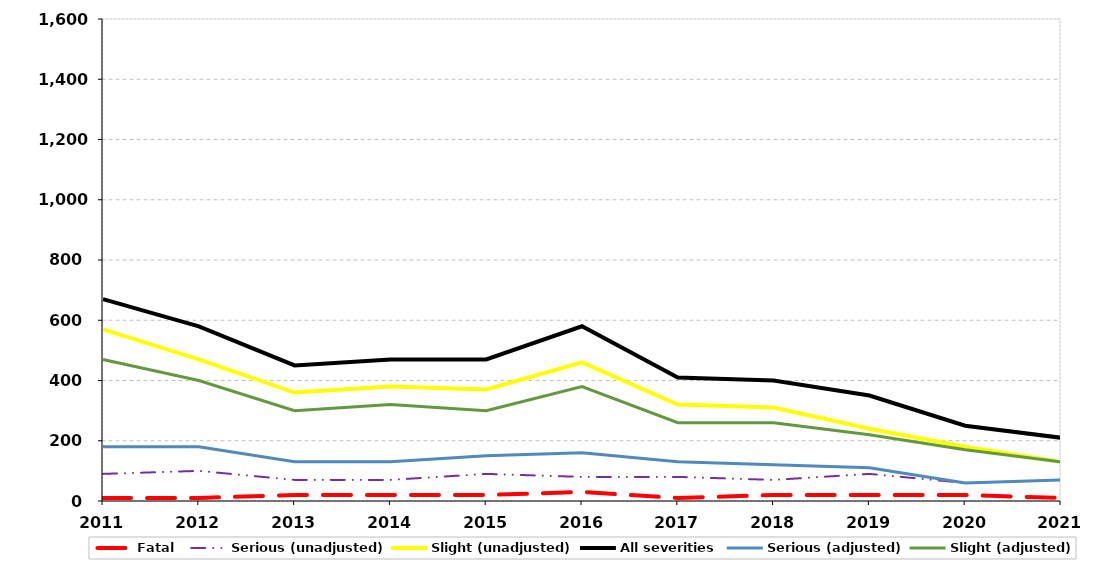
| Category | Fatal | Serious (unadjusted) | Slight (unadjusted) | All severities | Serious (adjusted) | Slight (adjusted) |
|---|---|---|---|---|---|---|
| 2011.0 | 10 | 90 | 570 | 670 | 180 | 470 |
| 2012.0 | 10 | 100 | 470 | 580 | 180 | 400 |
| 2013.0 | 20 | 70 | 360 | 450 | 130 | 300 |
| 2014.0 | 20 | 70 | 380 | 470 | 130 | 320 |
| 2015.0 | 20 | 90 | 370 | 470 | 150 | 300 |
| 2016.0 | 30 | 80 | 460 | 580 | 160 | 380 |
| 2017.0 | 10 | 80 | 320 | 410 | 130 | 260 |
| 2018.0 | 20 | 70 | 310 | 400 | 120 | 260 |
| 2019.0 | 20 | 90 | 240 | 350 | 110 | 220 |
| 2020.0 | 20 | 60 | 180 | 250 | 60 | 170 |
| 2021.0 | 10 | 70 | 130 | 210 | 70 | 130 |